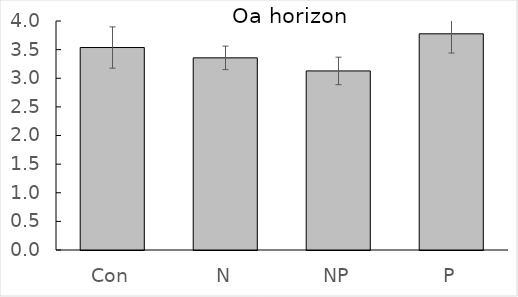
| Category | Series 0 |
|---|---|
| Con | 3.537 |
| N | 3.356 |
| NP | 3.128 |
| P | 3.776 |